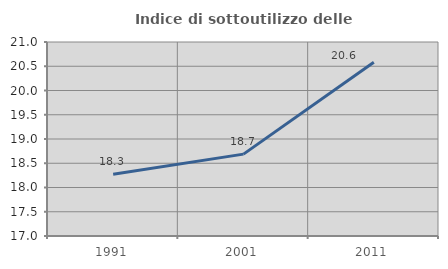
| Category | Indice di sottoutilizzo delle abitazioni  |
|---|---|
| 1991.0 | 18.271 |
| 2001.0 | 18.688 |
| 2011.0 | 20.581 |